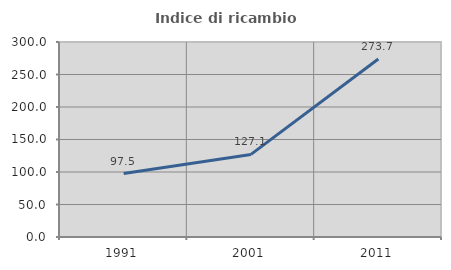
| Category | Indice di ricambio occupazionale  |
|---|---|
| 1991.0 | 97.529 |
| 2001.0 | 127.069 |
| 2011.0 | 273.735 |